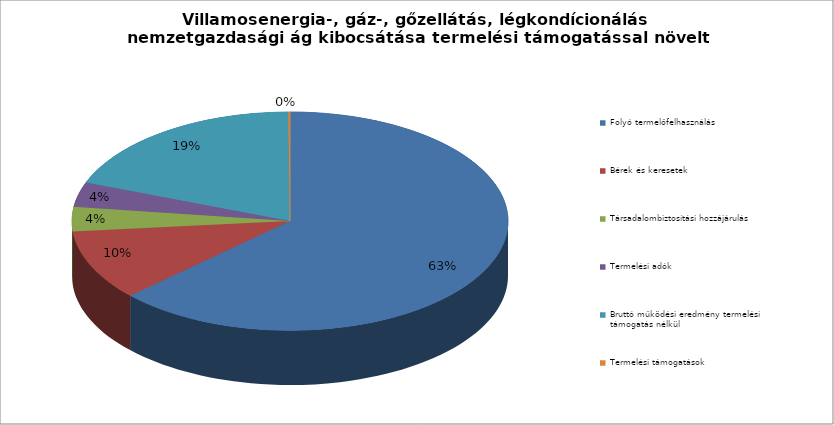
| Category | Villamosenergia-, gáz-, gőzellátás, légkondícionálás nemzetgazdasági ág kibocsátása termelési támogatással növelt összegének megoszlása 2013-ban |
|---|---|
| Folyó termelőfelhasználás | 936387 |
| Bérek és keresetek | 154640 |
| Társadalombiztosítási hozzájárulás | 53912 |
| Termelési adók | 54337 |
| Bruttó működési eredmény termelési támogatás nélkül | 283817 |
| Termelési támogatások | 1998 |